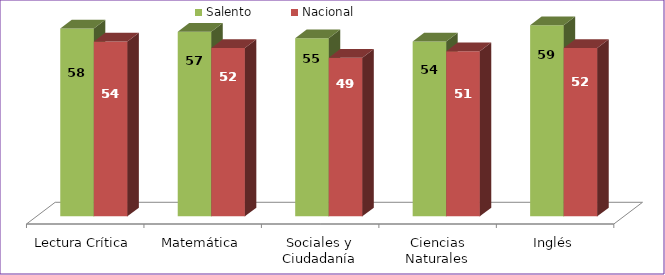
| Category | Salento | Nacional |
|---|---|---|
| Lectura Crítica | 58 | 54 |
| Matemática | 57 | 52 |
| Sociales y Ciudadanía | 55 | 49 |
| Ciencias Naturales | 54 | 51 |
| Inglés | 59 | 52 |